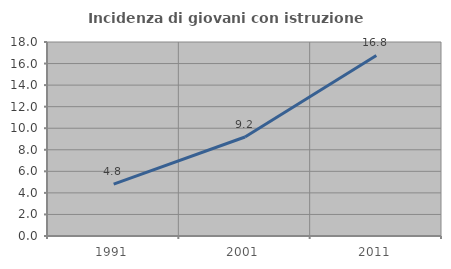
| Category | Incidenza di giovani con istruzione universitaria |
|---|---|
| 1991.0 | 4.808 |
| 2001.0 | 9.184 |
| 2011.0 | 16.757 |